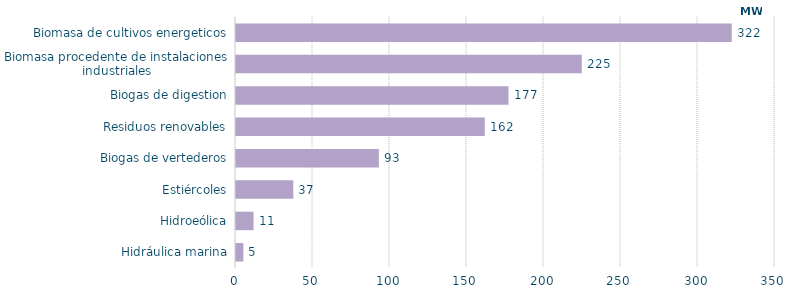
| Category | Series 0 |
|---|---|
| Hidráulica marina | 4.796 |
| Hidroeólica | 11.4 |
| Estiércoles | 37.2 |
| Biogas de vertederos | 92.763 |
| Residuos renovables | 161.526 |
| Biogas de digestion | 176.959 |
| Biomasa procedente de instalaciones industriales | 224.537 |
| Biomasa de cultivos energeticos | 321.897 |